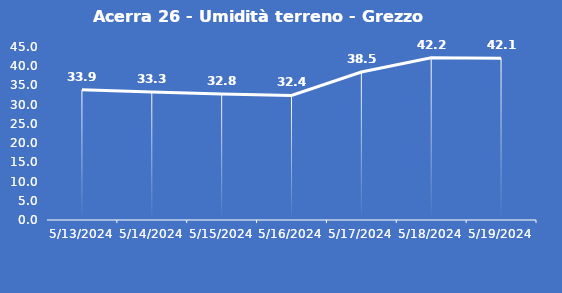
| Category | Acerra 26 - Umidità terreno - Grezzo (%VWC) |
|---|---|
| 5/13/24 | 33.9 |
| 5/14/24 | 33.3 |
| 5/15/24 | 32.8 |
| 5/16/24 | 32.4 |
| 5/17/24 | 38.5 |
| 5/18/24 | 42.2 |
| 5/19/24 | 42.1 |